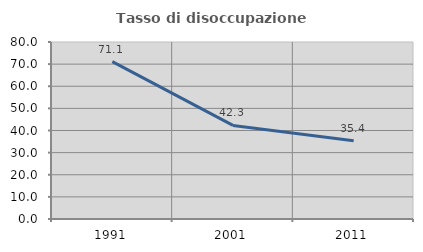
| Category | Tasso di disoccupazione giovanile  |
|---|---|
| 1991.0 | 71.146 |
| 2001.0 | 42.308 |
| 2011.0 | 35.417 |